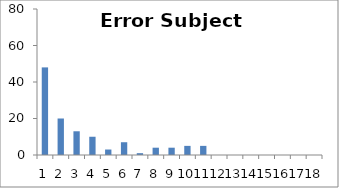
| Category | Sub6 |
|---|---|
| 0 | 48 |
| 1 | 20 |
| 2 | 13 |
| 3 | 10 |
| 4 | 3 |
| 5 | 7 |
| 6 | 1 |
| 7 | 4 |
| 8 | 4 |
| 9 | 5 |
| 10 | 5 |
| 11 | 0 |
| 12 | 0 |
| 13 | 0 |
| 14 | 0 |
| 15 | 0 |
| 16 | 0 |
| 17 | 0 |